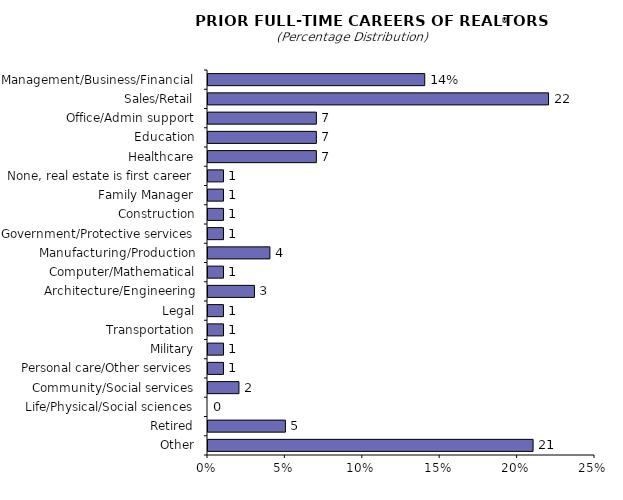
| Category | Series 0 |
|---|---|
| Management/Business/Financial | 14 |
| Sales/Retail | 22 |
| Office/Admin support | 7 |
| Education | 7 |
| Healthcare | 7 |
| None, real estate is first career | 1 |
| Family Manager | 1 |
| Construction | 1 |
| Government/Protective services | 1 |
| Manufacturing/Production | 4 |
| Computer/Mathematical | 1 |
| Architecture/Engineering | 3 |
| Legal | 1 |
| Transportation | 1 |
| Military | 1 |
| Personal care/Other services | 1 |
| Community/Social services | 2 |
| Life/Physical/Social sciences | 0 |
| Retired | 5 |
| Other | 21 |